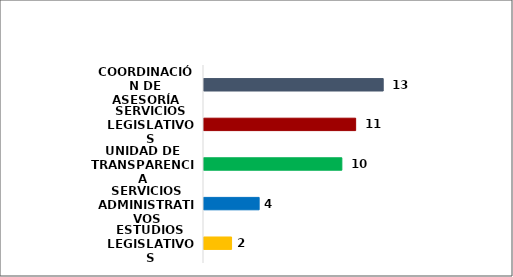
| Category | Series 0 |
|---|---|
| ESTUDIOS LEGISLATIVOS | 2 |
| SERVICIOS ADMINISTRATIVOS | 4 |
| UNIDAD DE TRANSPARENCIA | 10 |
| SERVICIOS LEGISLATIVOS | 11 |
| COORDINACIÓN DE ASESORÍA | 13 |